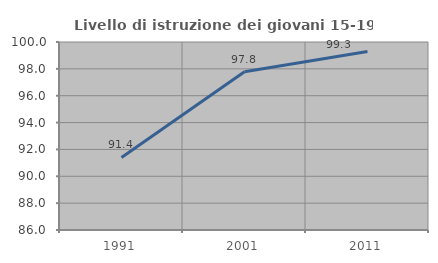
| Category | Livello di istruzione dei giovani 15-19 anni |
|---|---|
| 1991.0 | 91.403 |
| 2001.0 | 97.79 |
| 2011.0 | 99.291 |